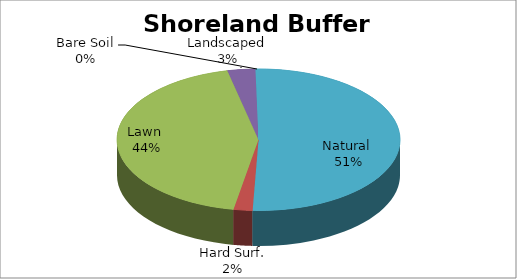
| Category | Total area |
|---|---|
| Natural  | 1308543.25 |
| Hard Surf. | 55587 |
| Lawn  | 1127456.75 |
| Landscaped | 82134.5 |
| Bare Soil | 8963.5 |